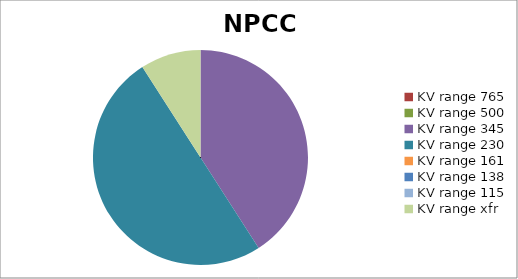
| Category | NPCC |
|---|---|
| 0 | 0 |
| 1 | 0 |
| 2 | 9 |
| 3 | 11 |
| 4 | 0 |
| 5 | 0 |
| 6 | 0 |
| 7 | 2 |